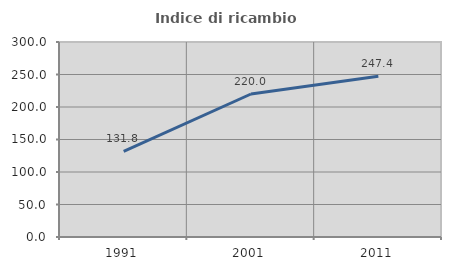
| Category | Indice di ricambio occupazionale  |
|---|---|
| 1991.0 | 131.818 |
| 2001.0 | 220 |
| 2011.0 | 247.368 |